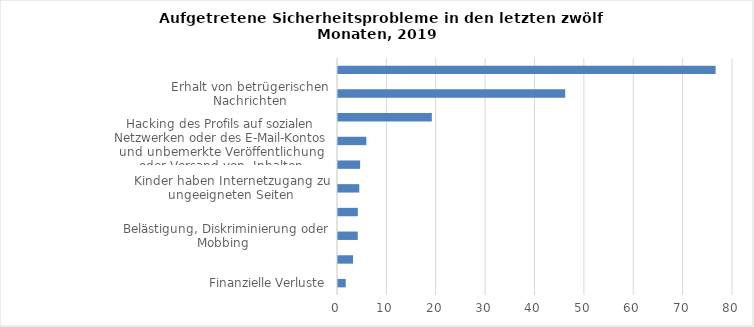
| Category | 2019 |
|---|---|
| Finanzielle Verluste | 1.565 |
| Identitätsdiebstahl | 3.049 |
| Belästigung, Diskriminierung oder Mobbing  | 4 |
| Verlust von Dokumenten wegen einem Virus oder einer anderen Infektion | 4.019 |
| Kinder haben Internetzugang zu ungeeigneten Seiten | 4.311 |
| Betrügerische Verwendung der Kredit- oder Debitkarte | 4.482 |
| Hacking des Profils auf sozialen Netzwerken oder des E-Mail-Kontos und unbemerkte Veröffentlichung oder Versand von  Inhalten | 5.742 |
| Umleitung auf gefälschte Internetseiten, wo persönliche Informationen erfragt werden | 19 |
| Erhalt von betrügerischen Nachrichten | 46.023 |
| Spam | 76.478 |